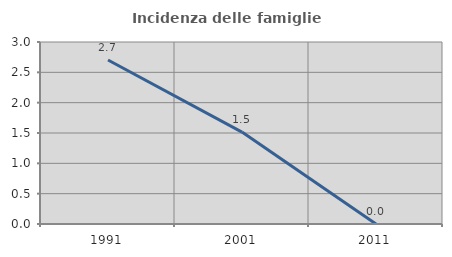
| Category | Incidenza delle famiglie numerose |
|---|---|
| 1991.0 | 2.703 |
| 2001.0 | 1.515 |
| 2011.0 | 0 |